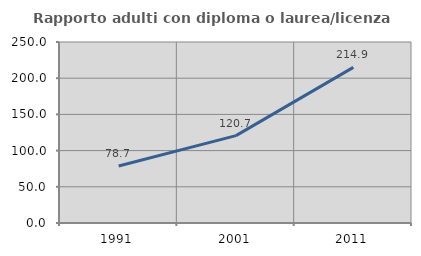
| Category | Rapporto adulti con diploma o laurea/licenza media  |
|---|---|
| 1991.0 | 78.655 |
| 2001.0 | 120.706 |
| 2011.0 | 214.888 |